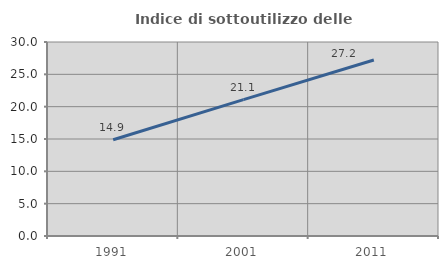
| Category | Indice di sottoutilizzo delle abitazioni  |
|---|---|
| 1991.0 | 14.884 |
| 2001.0 | 21.094 |
| 2011.0 | 27.214 |